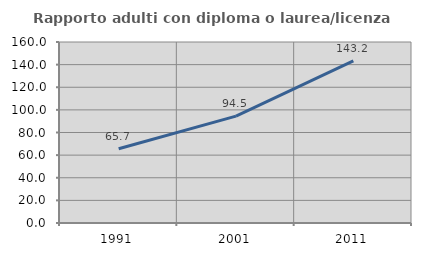
| Category | Rapporto adulti con diploma o laurea/licenza media  |
|---|---|
| 1991.0 | 65.66 |
| 2001.0 | 94.481 |
| 2011.0 | 143.223 |